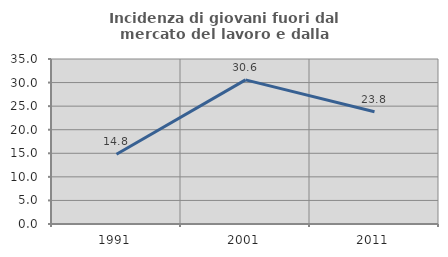
| Category | Incidenza di giovani fuori dal mercato del lavoro e dalla formazione  |
|---|---|
| 1991.0 | 14.793 |
| 2001.0 | 30.579 |
| 2011.0 | 23.81 |